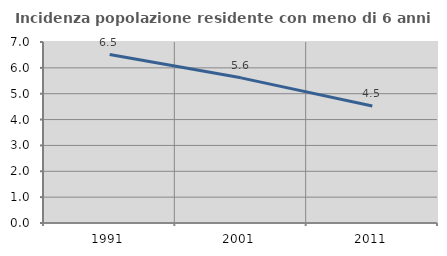
| Category | Incidenza popolazione residente con meno di 6 anni |
|---|---|
| 1991.0 | 6.516 |
| 2001.0 | 5.613 |
| 2011.0 | 4.526 |